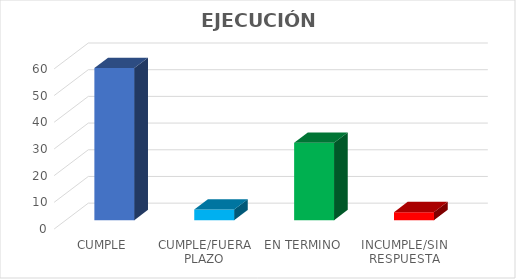
| Category | TOTAL |
|---|---|
| CUMPLE | 57 |
| CUMPLE/FUERA PLAZO | 4 |
| EN TERMINO | 29 |
| INCUMPLE/SIN RESPUESTA | 3 |